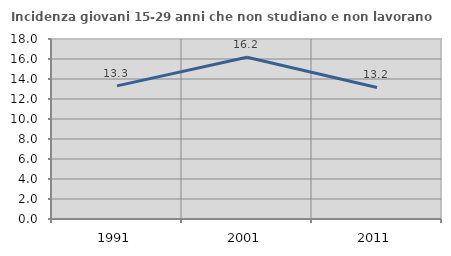
| Category | Incidenza giovani 15-29 anni che non studiano e non lavorano  |
|---|---|
| 1991.0 | 13.315 |
| 2001.0 | 16.176 |
| 2011.0 | 13.158 |